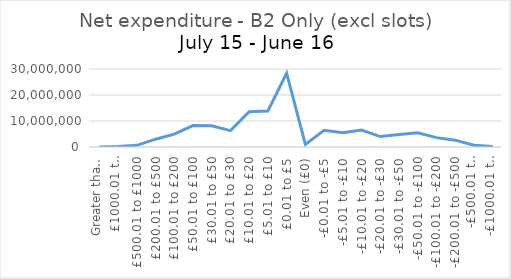
| Category | B2 Only (excl slots) |
|---|---|
| Greater than £5000 | 543 |
| £1000.01 to £5000 | 170217 |
| £500.01 to £1000 | 626897 |
| £200.01 to £500 | 3008317 |
| £100.01 to £200 | 4939356 |
| £50.01 to £100 | 8230583 |
| £30.01 to £50 | 8156362 |
| £20.01 to £30 | 6294765 |
| £10.01 to £20 | 13570820 |
| £5.01 to £10 | 13876857 |
| £0.01 to £5 | 28399050 |
| Even (£0) | 1003941 |
| -£0.01 to -£5 | 6454999 |
| -£5.01 to -£10 | 5496596 |
| -£10.01 to -£20 | 6503263 |
| -£20.01 to -£30 | 4002288 |
| -£30.01 to -£50 | 4783241 |
| -£50.01 to -£100 | 5502271 |
| -£100.01 to -£200 | 3610064 |
| -£200.01 to -£500 | 2628258 |
| -£500.01 to -£1000 | 700063 |
| -£1000.01 to -£5000 | 208872 |